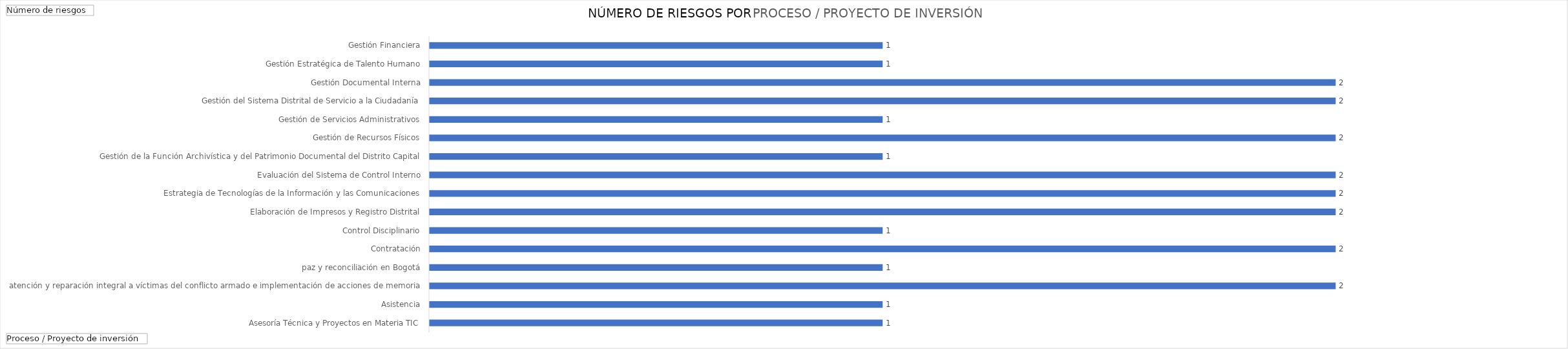
| Category | Total |
|---|---|
| Asesoría Técnica y Proyectos en Materia TIC | 1 |
| Asistencia, atención y reparación integral a víctimas del conflicto armado e implementación de acciones de memoria, paz y reconciliación en Bogotá | 1 |
| Contratación | 2 |
| Control Disciplinario | 1 |
| Elaboración de Impresos y Registro Distrital | 2 |
| Estrategia de Tecnologías de la Información y las Comunicaciones | 1 |
| Evaluación del Sistema de Control Interno | 2 |
| Gestión de la Función Archivística y del Patrimonio Documental del Distrito Capital | 2 |
| Gestión de Recursos Físicos | 2 |
| Gestión de Servicios Administrativos | 1 |
| Gestión del Sistema Distrital de Servicio a la Ciudadanía | 2 |
| Gestión Documental Interna | 1 |
| Gestión Estratégica de Talento Humano | 2 |
| Gestión Financiera | 2 |
| Gestión Jurídica | 1 |
| Gestión, Administración y Soporte de infraestructura y Recursos tecnológicos | 1 |